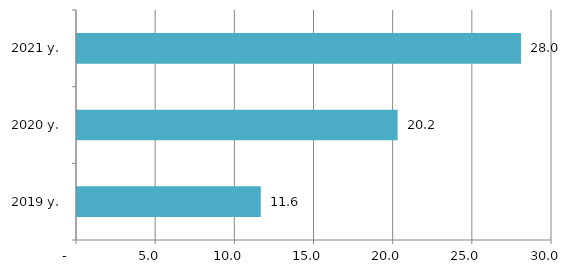
| Category | Series 0 |
|---|---|
| 2019 y. | 11.608 |
| 2020 y. | 20.25 |
| 2021 y. | 28.049 |